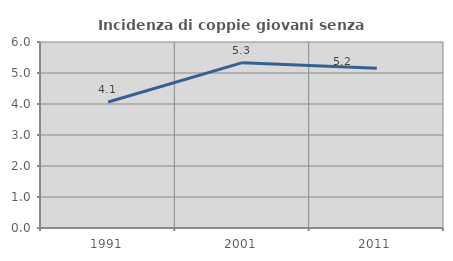
| Category | Incidenza di coppie giovani senza figli |
|---|---|
| 1991.0 | 4.065 |
| 2001.0 | 5.333 |
| 2011.0 | 5.155 |